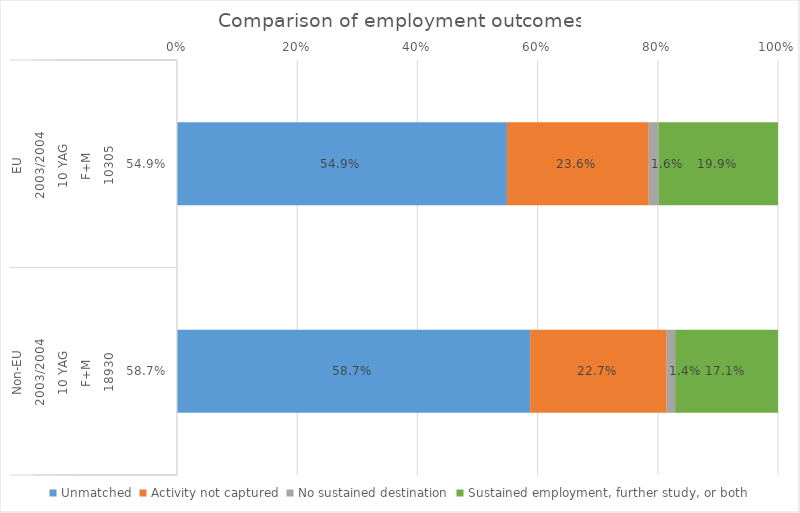
| Category | Unmatched | Activity not captured | No sustained destination | Sustained employment, further study, or both |
|---|---|---|---|---|
| 0 | 0.549 | 0.236 | 0.016 | 0.199 |
| 1 | 0.587 | 0.227 | 0.014 | 0.171 |